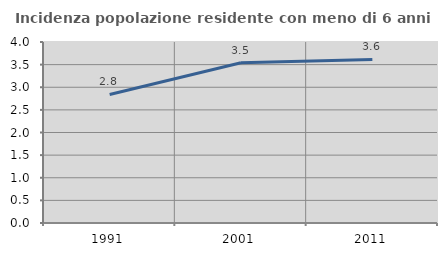
| Category | Incidenza popolazione residente con meno di 6 anni |
|---|---|
| 1991.0 | 2.84 |
| 2001.0 | 3.542 |
| 2011.0 | 3.616 |